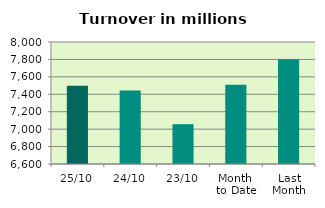
| Category | Series 0 |
|---|---|
| 25/10 | 7497.171 |
| 24/10 | 7442.092 |
| 23/10 | 7056.576 |
| Month 
to Date | 7508.952 |
| Last
Month | 7802.515 |